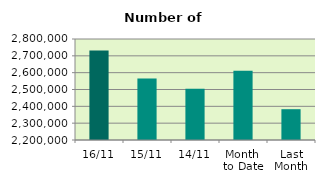
| Category | Series 0 |
|---|---|
| 16/11 | 2731214 |
| 15/11 | 2565232 |
| 14/11 | 2503882 |
| Month 
to Date | 2611485.167 |
| Last
Month | 2382963.143 |